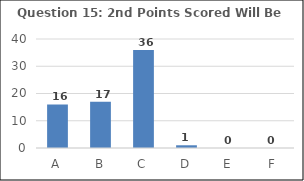
| Category | Series 0 |
|---|---|
| A | 16 |
| B | 17 |
| C | 36 |
| D | 1 |
| E | 0 |
| F | 0 |